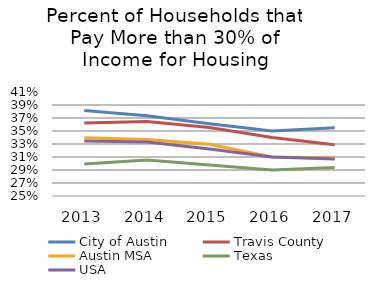
| Category | City of Austin | Travis County | Austin MSA | Texas | USA |
|---|---|---|---|---|---|
| 2013.0 | 0.382 | 0.362 | 0.34 | 0.299 | 0.335 |
| 2014.0 | 0.373 | 0.365 | 0.337 | 0.305 | 0.333 |
| 2015.0 | 0.361 | 0.355 | 0.33 | 0.298 | 0.322 |
| 2016.0 | 0.35 | 0.34 | 0.31 | 0.29 | 0.31 |
| 2017.0 | 0.355 | 0.329 | 0.309 | 0.294 | 0.307 |